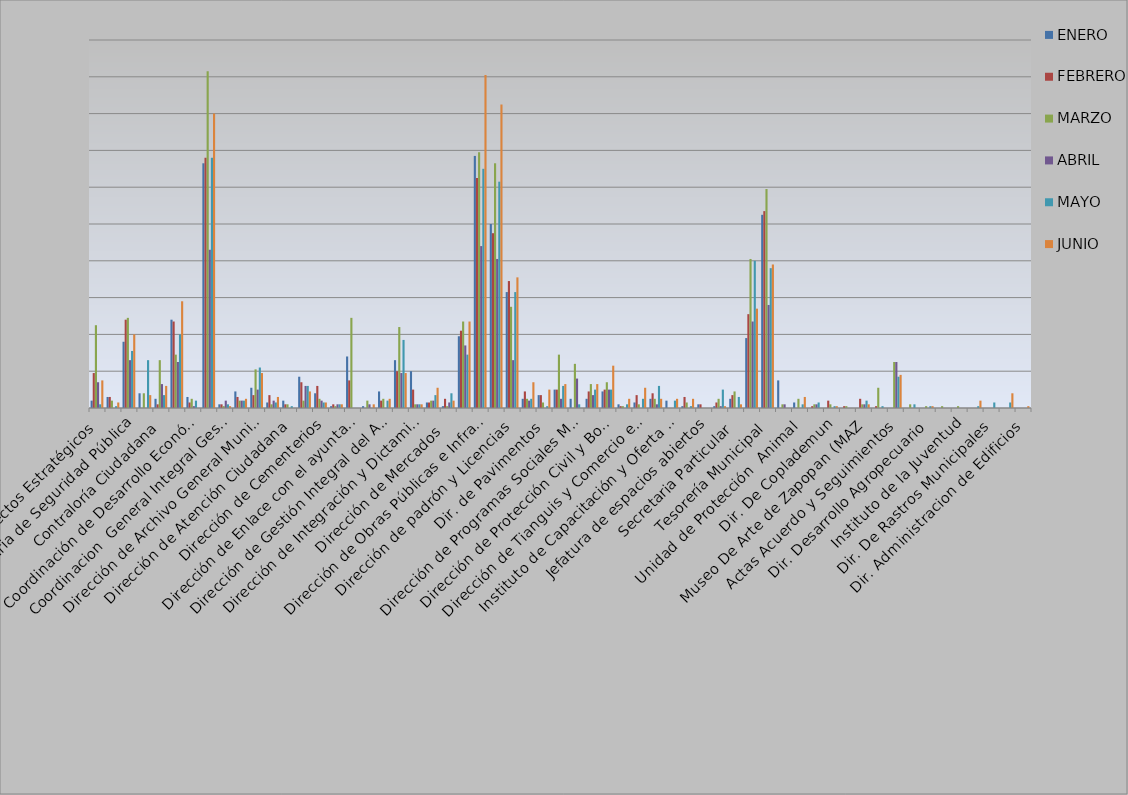
| Category | ENERO | FEBRERO | MARZO | ABRIL | MAYO | JUNIO |
|---|---|---|---|---|---|---|
| Area de Proyectos Estratégicos | 4 | 19 | 45 | 14 | 2 | 15 |
| Área de Relaciones Públicas | 6 | 6 | 4 | 0 | 1 | 3 |
| Comisaria de Seguridad Pública | 36 | 48 | 49 | 26 | 31 | 40 |
| Comunicación Social y Analisis Estrategico  | 8 | 0 | 8 | 0 | 26 | 7 |
| Contraloría Ciudadana | 5 | 2 | 26 | 13 | 7 | 12 |
| Coordinación General de Servicios Municipales | 48 | 47 | 29 | 25 | 40 | 58 |
| Coordinación de Desarrollo Económico Y Combate a la Desigualdad | 6 | 3 | 5 | 1 | 4 | 0 |
| Coordinación General de Administración e Innovación Gubernamental | 133 | 136 | 183 | 86 | 136 | 160 |
| Coordinacion  General Integral Gestion de la Ciudad | 2 | 2 | 1 | 4 | 2 | 1 |
| Dirección de Alumbrado Público | 9 | 6 | 4 | 4 | 4 | 5 |
| Dirección de Archivo General Municipal  | 11 | 7 | 21 | 10 | 22 | 19 |
| Dirección de Aseo Público  | 3 | 7 | 2 | 4 | 3 | 6 |
| Dirección de Atención Ciudadana | 4 | 2 | 2 | 0 | 1 | 0 |
| Dirección de Catastro | 17 | 14 | 4 | 12 | 12 | 9 |
| Dirección de Cementerios | 8 | 12 | 5 | 4 | 3 | 3 |
| Dirección de Educación  | 1 | 2 | 1 | 2 | 2 | 2 |
| Dirección de Enlace con el ayuntamiento | 28 | 15 | 49 | 0 | 0 | 0 |
| Dirección de Fomento al empleo y  emprendurismo         | 1 | 0 | 4 | 2 | 0 | 2 |
| Dirección de Gestión Integral del Agua y Drenaje | 9 | 4 | 5 | 0 | 4 | 5 |
| Dirección de Inspección y Vigilancia | 26 | 20 | 44 | 19 | 37 | 19 |
| Dirección de Integración y Dictaminación | 20 | 10 | 2 | 2 | 2 | 2 |
| Dirección de Mejoramiento Urbano | 3 | 3 | 4 | 4 | 7 | 11 |
| Dirección de Mercados  | 1 | 5 | 1 | 3 | 8 | 4 |
| Dirección  de Movilidad y Transporte | 39 | 42 | 47 | 34 | 29 | 47 |
| Dirección de Obras Públicas e Infraestructura | 137 | 125 | 139 | 88 | 130 | 181 |
| Dirección de Ordenamiento del Territorio  | 100 | 95 | 133 | 81 | 123 | 165 |
| Dirección de padrón y Licencias  | 63 | 69 | 55 | 26 | 63 | 71 |
| Dirección de Parques y Jardines  | 5 | 9 | 5 | 4 | 5 | 14 |
| Dir. de Pavimentos | 7 | 7 | 3 | 0 | 1 | 10 |
| Dirección de Participación Ciudadana | 10 | 10 | 29 | 5 | 12 | 13 |
| Dirección de Programas Sociales Municipales | 5 | 0 | 24 | 16 | 2 | 0 |
| Dirección de Protección al Medio Ambiente  | 5 | 9 | 13 | 7 | 10 | 13 |
| Dirección de Protección Civil y Bomberos | 9 | 10 | 14 | 10 | 10 | 23 |
| Dir. de Registro Civil | 2 | 1 | 1 | 0 | 2 | 5 |
| Dirección de Tianguis y Comercio en espacios Abiertos | 3 | 7 | 2 | 0 | 5 | 11 |
| Dirección de Transparencia y Buenas Prácticas | 5 | 8 | 5 | 2 | 12 | 5 |
| Instituto de Capacitación y Oferta Educativa | 4 | 0 | 0 | 0 | 4 | 5 |
| Instituto de Cultura  | 1 | 6 | 3 | 0 | 1 | 5 |
| Jefatura de espacios abiertos | 2 | 2 | 0 | 0 | 0 | 0 |
| Secretaría del Ayuntamiento | 1 | 3 | 5 | 1 | 10 | 1 |
| Secretaria Particular | 5 | 7 | 9 | 0 | 6 | 2 |
| Sindicatura Municipal | 38 | 51 | 81 | 47 | 80 | 54 |
| Tesorería Municipal | 105 | 107 | 119 | 56 | 76 | 78 |
| Unidad de Patrimonio Municipal  | 15 | 0 | 2 | 2 | 0 | 0 |
| Unidad de Protección  Animal  | 3 | 0 | 5 | 0 | 2 | 6 |
| Coord. Gral. De Construccion de la Comunidad | 0 | 1 | 2 | 2 | 3 | 0 |
| Dir. De Coplademun | 0 | 4 | 2 | 0 | 1 | 1 |
| Instituto de las Mujeres Zapopanas | 0 | 1 | 1 | 0 | 0 | 0 |
| Museo De Arte de Zapopan (MAZ | 0 | 5 | 2 | 2 | 4 | 2 |
| Regidores | 0 | 1 | 11 | 0 | 1 | 0 |
| Actas Acuerdo y Seguimientos  | 0 | 0 | 25 | 25 | 17 | 18 |
| Dir. De Delegaciones y Agencias Municipales | 0 | 0 | 2 | 0 | 2 | 0 |
|  Dir. Desarrollo Agropecuario | 0 | 0 | 1 | 0 | 1 | 1 |
| Dir. Desarrollo Economico | 0 | 0 | 1 | 0 | 0 | 0 |
| Instituto de la Juventud | 0 | 0 | 1 | 0 | 0 | 0 |
| Dir. De Asuntos Internos | 0 | 0 | 0 | 0 | 1 | 4 |
| Dir. De Rastros Municipales | 0 | 0 | 0 | 0 | 3 | 0 |
| Jefatura de Gabinete | 0 | 0 | 0 | 0 | 3 | 8 |
| Dir. Administracion de Edificios | 0 | 0 | 0 | 0 | 0 | 1 |